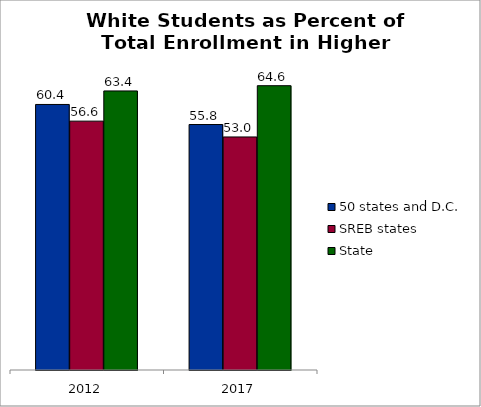
| Category | 50 states and D.C. | SREB states | State |
|---|---|---|---|
| 2012.0 | 60.351 | 56.56 | 63.421 |
| 2017.0 | 55.79 | 52.964 | 64.613 |